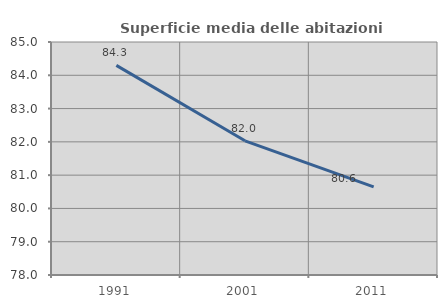
| Category | Superficie media delle abitazioni occupate |
|---|---|
| 1991.0 | 84.297 |
| 2001.0 | 82.032 |
| 2011.0 | 80.647 |